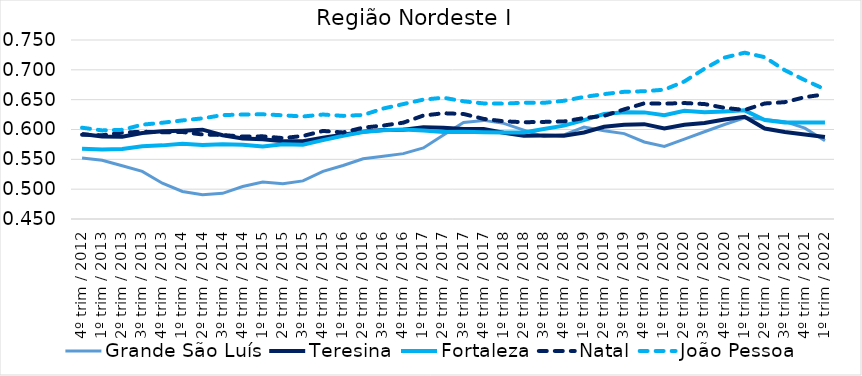
| Category | Grande São Luís | Teresina | Fortaleza | Natal | João Pessoa |
|---|---|---|---|---|---|
| 4º trim / 2012 | 0.552 | 0.592 | 0.568 | 0.591 | 0.603 |
| 1º trim / 2013 | 0.548 | 0.588 | 0.567 | 0.59 | 0.598 |
| 2º trim / 2013 | 0.539 | 0.588 | 0.567 | 0.595 | 0.599 |
| 3º trim / 2013 | 0.53 | 0.594 | 0.572 | 0.596 | 0.608 |
| 4º trim / 2013 | 0.51 | 0.597 | 0.573 | 0.595 | 0.611 |
| 1º trim / 2014 | 0.496 | 0.598 | 0.576 | 0.596 | 0.615 |
| 2º trim / 2014 | 0.491 | 0.6 | 0.574 | 0.592 | 0.619 |
| 3º trim / 2014 | 0.493 | 0.59 | 0.575 | 0.591 | 0.624 |
| 4º trim / 2014 | 0.505 | 0.585 | 0.575 | 0.588 | 0.625 |
| 1º trim / 2015 | 0.512 | 0.583 | 0.571 | 0.589 | 0.625 |
| 2º trim / 2015 | 0.509 | 0.58 | 0.575 | 0.586 | 0.624 |
| 3º trim / 2015 | 0.514 | 0.58 | 0.574 | 0.589 | 0.622 |
| 4º trim / 2015 | 0.53 | 0.586 | 0.582 | 0.598 | 0.625 |
| 1º trim / 2016 | 0.54 | 0.591 | 0.589 | 0.595 | 0.623 |
| 2º trim / 2016 | 0.551 | 0.596 | 0.596 | 0.603 | 0.624 |
| 3º trim / 2016 | 0.555 | 0.599 | 0.599 | 0.607 | 0.635 |
| 4º trim / 2016 | 0.56 | 0.6 | 0.6 | 0.611 | 0.643 |
| 1º trim / 2017 | 0.569 | 0.604 | 0.598 | 0.623 | 0.65 |
| 2º trim / 2017 | 0.591 | 0.603 | 0.596 | 0.627 | 0.653 |
| 3º trim / 2017 | 0.612 | 0.601 | 0.596 | 0.626 | 0.647 |
| 4º trim / 2017 | 0.615 | 0.601 | 0.595 | 0.618 | 0.644 |
| 1º trim / 2018 | 0.61 | 0.594 | 0.595 | 0.614 | 0.643 |
| 2º trim / 2018 | 0.599 | 0.59 | 0.595 | 0.612 | 0.645 |
| 3º trim / 2018 | 0.588 | 0.59 | 0.601 | 0.613 | 0.645 |
| 4º trim / 2018 | 0.591 | 0.59 | 0.606 | 0.613 | 0.648 |
| 1º trim / 2019 | 0.604 | 0.595 | 0.616 | 0.619 | 0.655 |
| 2º trim / 2019 | 0.598 | 0.605 | 0.626 | 0.623 | 0.659 |
| 3º trim / 2019 | 0.593 | 0.608 | 0.629 | 0.634 | 0.663 |
| 4º trim / 2019 | 0.579 | 0.609 | 0.629 | 0.644 | 0.664 |
| 1º trim / 2020 | 0.572 | 0.602 | 0.624 | 0.643 | 0.667 |
| 2º trim / 2020 | 0.584 | 0.608 | 0.632 | 0.644 | 0.681 |
| 3º trim / 2020 | 0.596 | 0.611 | 0.629 | 0.643 | 0.702 |
| 4º trim / 2020 | 0.608 | 0.617 | 0.63 | 0.636 | 0.721 |
| 1º trim / 2021 | 0.62 | 0.621 | 0.632 | 0.633 | 0.729 |
| 2º trim / 2021 | 0.617 | 0.602 | 0.616 | 0.644 | 0.721 |
| 3º trim / 2021 | 0.613 | 0.596 | 0.612 | 0.646 | 0.699 |
| 4º trim / 2021 | 0.602 | 0.592 | 0.612 | 0.654 | 0.683 |
| 1º trim / 2022 | 0.581 | 0.587 | 0.612 | 0.659 | 0.667 |